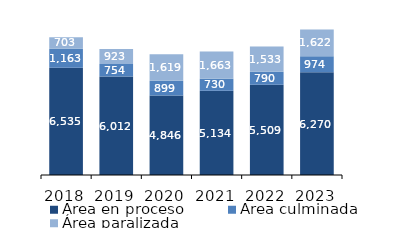
| Category | Área en proceso | Área culminada | Área paralizada |
|---|---|---|---|
| 2018.0 | 6534.66 | 1162.692 | 703.018 |
| 2019.0 | 6012.043 | 753.634 | 923.158 |
| 2020.0 | 4846.365 | 898.95 | 1619.2 |
| 2021.0 | 5134.278 | 730.029 | 1663.448 |
| 2022.0 | 5509.081 | 790.471 | 1533.488 |
| 2023.0 | 6269.715 | 974.031 | 1621.735 |